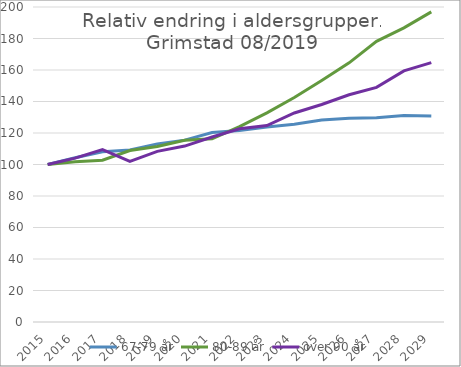
| Category | 67-79 år | 80-89 år | over 90 år |
|---|---|---|---|
| 2015.0 | 100 | 100 | 100 |
| 2016.0 | 104.272 | 101.807 | 104.054 |
| 2017.0 | 108.094 | 102.711 | 109.459 |
| 2018.0 | 109.173 | 108.886 | 102.027 |
| 2019.0 | 113.021 | 111.459 | 108.359 |
| 2020.0 | 115.483 | 115.44 | 111.715 |
| 2021.0 | 120.279 | 116.306 | 117.482 |
| 2022.0 | 121.657 | 123.998 | 122.656 |
| 2023.0 | 123.805 | 132.755 | 124.756 |
| 2024.0 | 125.525 | 142.519 | 132.734 |
| 2025.0 | 128.2 | 153.277 | 138.115 |
| 2026.0 | 129.319 | 164.535 | 144.287 |
| 2027.0 | 129.615 | 178.229 | 148.98 |
| 2028.0 | 131.181 | 186.778 | 159.439 |
| 2029.0 | 130.824 | 196.902 | 164.717 |